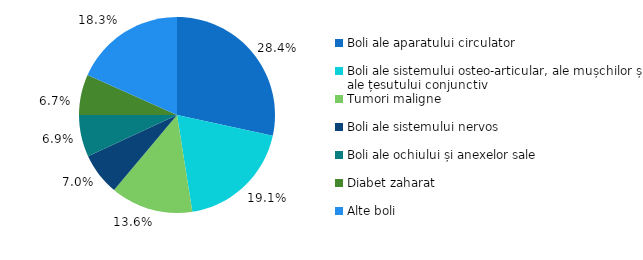
| Category | 2022 |
|---|---|
| Boli ale aparatului circulator | 28.4 |
| Boli ale sistemului osteo-articular, ale mușchilor și ale țesutului conjunctiv | 19.1 |
| Tumori maligne | 13.6 |
| Boli ale sistemului nervos | 7 |
| Boli ale ochiului și anexelor sale | 6.9 |
| Diabet zaharat | 6.7 |
| Alte boli | 18.3 |